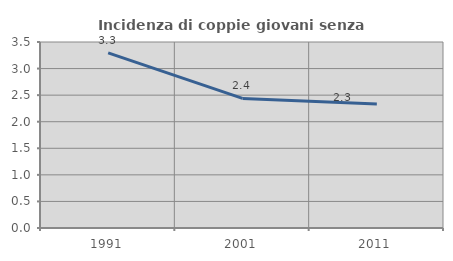
| Category | Incidenza di coppie giovani senza figli |
|---|---|
| 1991.0 | 3.297 |
| 2001.0 | 2.439 |
| 2011.0 | 2.333 |